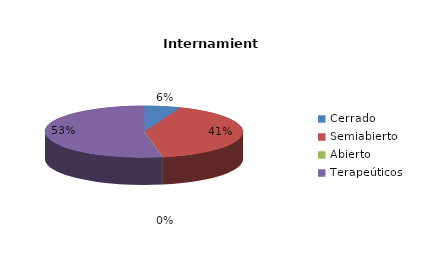
| Category | Series 0 |
|---|---|
| Cerrado | 1 |
| Semiabierto | 7 |
| Abierto | 0 |
| Terapeúticos | 9 |